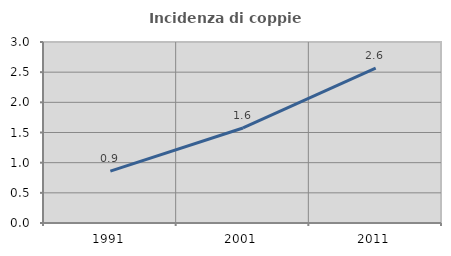
| Category | Incidenza di coppie miste |
|---|---|
| 1991.0 | 0.86 |
| 2001.0 | 1.575 |
| 2011.0 | 2.569 |